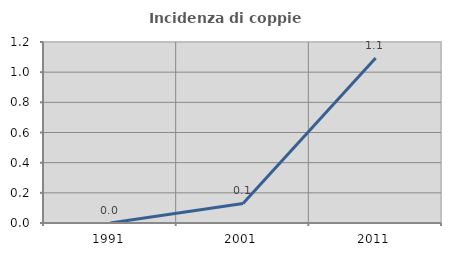
| Category | Incidenza di coppie miste |
|---|---|
| 1991.0 | 0 |
| 2001.0 | 0.13 |
| 2011.0 | 1.094 |